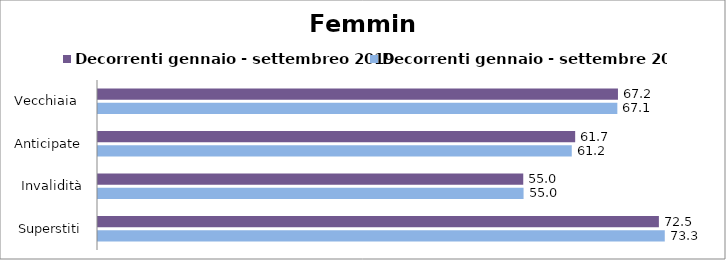
| Category | Decorrenti gennaio - settembreo 2019 | Decorrenti gennaio - settembre 2020 |
|---|---|---|
| Vecchiaia  | 67.2 | 67.12 |
|  Anticipate | 61.67 | 61.23 |
| Invalidità | 54.96 | 55 |
| Superstiti | 72.49 | 73.25 |